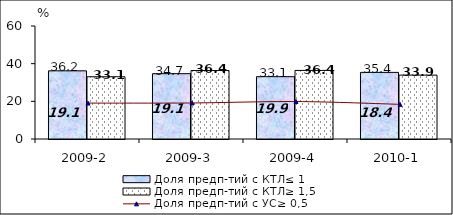
| Category | Доля предп-тий с КТЛ≤ 1 | Доля предп-тий с КТЛ≥ 1,5 |
|---|---|---|
| 2009-2 | 36.196 | 33.05 |
| 2009-3 | 34.694 | 36.355 |
| 2009-4 | 33.091 | 36.421 |
| 2010-1 | 35.369 | 33.913 |